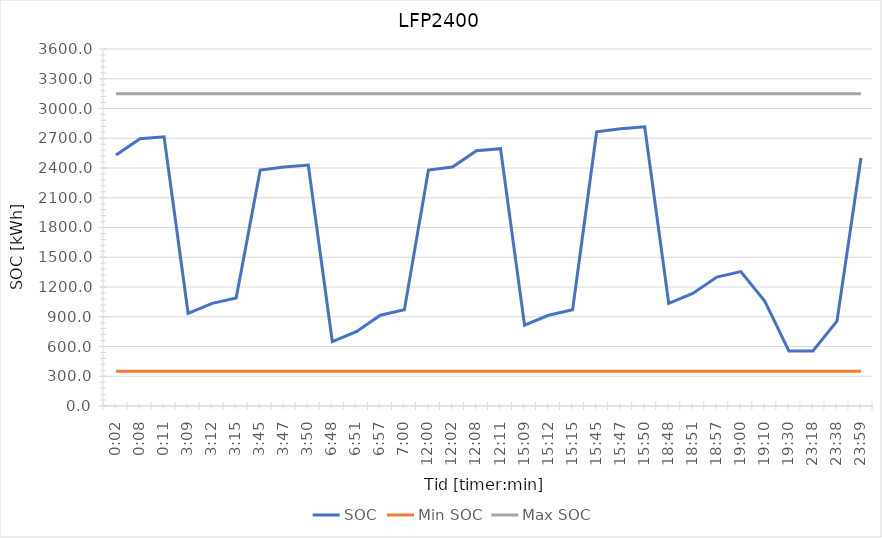
| Category | SOC | Min SOC | Max SOC |
|---|---|---|---|
| 0.001388888888888889 | 2530 | 350 | 3150 |
| 0.005555555555555556 | 2695 | 350 | 3150 |
| 0.007638888888888889 | 2715 | 350 | 3150 |
| 0.13125 | 935 | 350 | 3150 |
| 0.13333333333333333 | 1035 | 350 | 3150 |
| 0.13541666666666666 | 1090 | 350 | 3150 |
| 0.15625 | 2380 | 350 | 3150 |
| 0.15763888888888888 | 2410 | 350 | 3150 |
| 0.15972222222222224 | 2430 | 350 | 3150 |
| 0.2833333333333333 | 650 | 350 | 3150 |
| 0.28541666666666665 | 750 | 350 | 3150 |
| 0.28958333333333336 | 915 | 350 | 3150 |
| 0.2916666666666667 | 970 | 350 | 3150 |
| 0.5 | 2380 | 350 | 3150 |
| 0.5013888888888889 | 2410 | 350 | 3150 |
| 0.5055555555555555 | 2575 | 350 | 3150 |
| 0.5076388888888889 | 2595 | 350 | 3150 |
| 0.63125 | 815 | 350 | 3150 |
| 0.6333333333333333 | 915 | 350 | 3150 |
| 0.6354166666666666 | 970 | 350 | 3150 |
| 0.65625 | 2765 | 350 | 3150 |
| 0.6576388888888889 | 2795 | 350 | 3150 |
| 0.6597222222222222 | 2815 | 350 | 3150 |
| 0.7833333333333333 | 1035 | 350 | 3150 |
| 0.7854166666666668 | 1135 | 350 | 3150 |
| 0.7895833333333333 | 1300 | 350 | 3150 |
| 0.7916666666666666 | 1355 | 350 | 3150 |
| 0.7986111111111112 | 1055 | 350 | 3150 |
| 0.8125 | 555 | 350 | 3150 |
| 0.9708333333333333 | 555 | 350 | 3150 |
| 0.9847222222222222 | 855 | 350 | 3150 |
| 0.9993055555555556 | 2500 | 350 | 3150 |